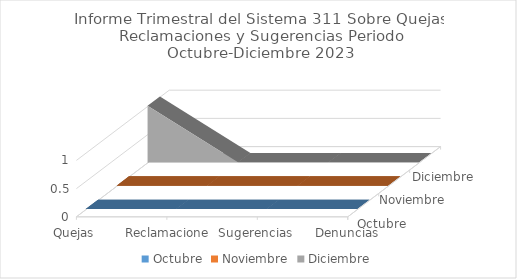
| Category | Octubre | Noviembre | Diciembre |
|---|---|---|---|
| Quejas | 0 | 0 | 1 |
| Reclamaciones | 0 | 0 | 0 |
| Sugerencias | 0 | 0 | 0 |
| Denuncias | 0 | 0 | 0 |